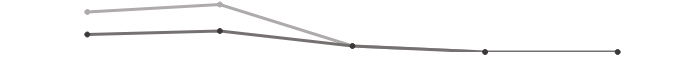
| Category | Series 0 | Series 1 | Series 2 |
|---|---|---|---|
| 2017.0 | 800 | 450 | 350 |
| 2018.0 | 950 | 530 | 420 |
| 2019.0 | 120 | 0 | 120 |
| 2020.0 | 0 | 0 | 0 |
| 2021.0 | 0 | 0 | 0 |